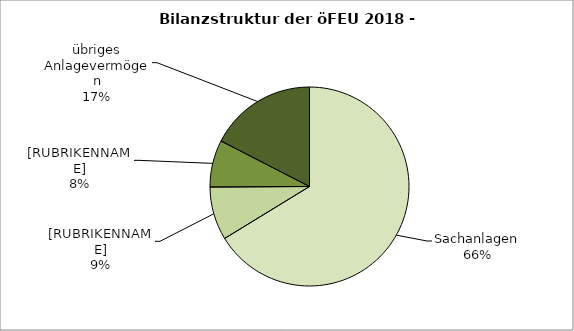
| Category | Series 0 |
|---|---|
| Sachanlagen | 66.252 |
| übriges Umlaufvermögen übrige Aktiva | 8.658 |
| Forderungen | 7.644 |
| übriges Anlagevermögen | 17.445 |